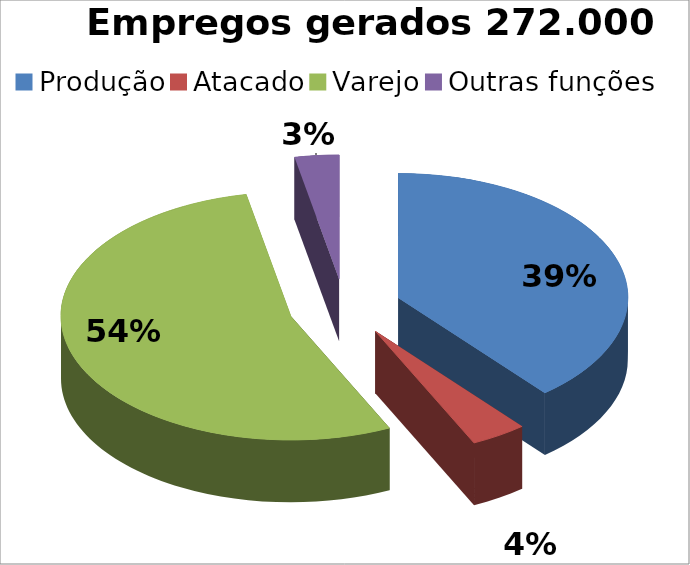
| Category | Series 0 |
|---|---|
| Produção | 105980 |
| Atacado | 10780 |
| Varejo | 146780 |
| Outras funções | 8460 |